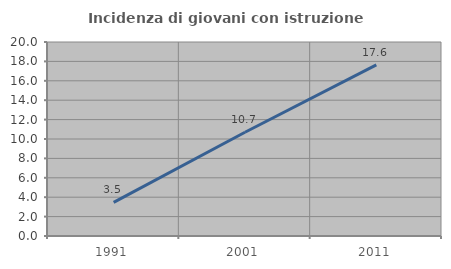
| Category | Incidenza di giovani con istruzione universitaria |
|---|---|
| 1991.0 | 3.472 |
| 2001.0 | 10.693 |
| 2011.0 | 17.647 |